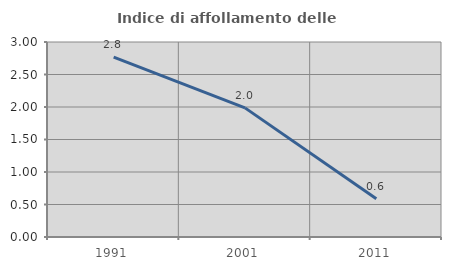
| Category | Indice di affollamento delle abitazioni  |
|---|---|
| 1991.0 | 2.767 |
| 2001.0 | 1.987 |
| 2011.0 | 0.589 |